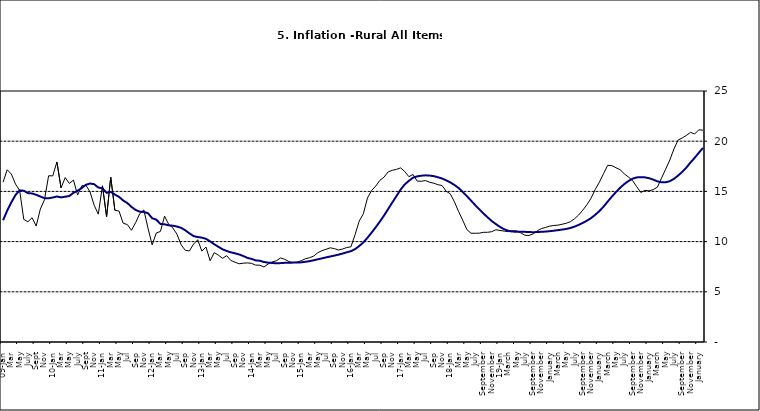
| Category | Series 0 | Series 1 |
|---|---|---|
| 09-Jan | 15.918 | 12.128 |
| Feb | 17.154 | 13.086 |
| Mar | 16.729 | 13.912 |
| Apr | 15.727 | 14.644 |
| May | 15.113 | 15.104 |
| June | 12.213 | 15.067 |
| July | 11.974 | 14.832 |
| Aug | 12.38 | 14.796 |
| Sept | 11.548 | 14.661 |
| Oct | 13.242 | 14.488 |
| Nov | 14.164 | 14.321 |
|  | 16.557 | 14.316 |
| 10-Jan | 16.548 | 14.39 |
| Feb | 17.934 | 14.494 |
| Mar | 15.346 | 14.401 |
| Apr | 16.373 | 14.473 |
| May | 15.794 | 14.54 |
| June | 16.126 | 14.862 |
| July | 14.634 | 15.072 |
| Aug | 15.556 | 15.33 |
| Sept | 15.616 | 15.658 |
| Oct | 14.955 | 15.786 |
| Nov | 13.616 | 15.719 |
| Dec | 12.735 | 15.385 |
| 11-Jan | 15.553 | 15.311 |
| Feb | 12.482 | 14.856 |
| Mar | 16.422 | 14.956 |
| Apr | 13.117 | 14.687 |
| May | 13.041 | 14.457 |
| Jun | 11.83 | 14.095 |
| Jul | 11.699 | 13.84 |
| Aug | 11.13 | 13.464 |
| Sep | 11.878 | 13.156 |
| Oct | 12.778 | 12.985 |
| Nov | 13.147 | 12.95 |
| Dec | 11.326 | 12.824 |
| 12-Jan | 9.678 | 12.33 |
| Feb | 10.856 | 12.188 |
| Mar | 11.014 | 11.76 |
| Apr | 12.536 | 11.724 |
| May | 11.712 | 11.621 |
| Jun | 11.36 | 11.582 |
| Jul | 10.733 | 11.499 |
| Aug | 9.683 | 11.368 |
| Sep | 9.132 | 11.131 |
| Oct | 9.071 | 10.82 |
| Nov | 9.758 | 10.548 |
| Dec | 10.183 | 10.455 |
| 13-Jan | 9.052 | 10.394 |
| Feb | 9.457 | 10.276 |
| Mar | 8.091 | 10.025 |
| Apr | 8.907 | 9.732 |
| May | 8.647 | 9.483 |
| Jun | 8.333 | 9.236 |
| Jul | 8.6 | 9.063 |
| Aug | 8.12 | 8.933 |
| Sep | 7.95 | 8.832 |
| Oct | 7.791 | 8.722 |
| Nov | 7.849 | 8.565 |
| Dec | 7.879 | 8.378 |
| 14-Jan | 7.832 | 8.277 |
| Feb | 7.657 | 8.13 |
| Mar | 7.65 | 8.092 |
| Apr | 7.473 | 7.973 |
| May | 7.761 | 7.901 |
| Jun | 7.98 | 7.874 |
| Jul | 8.086 | 7.834 |
| Aug | 8.368 | 7.858 |
| Sep | 8.244 | 7.883 |
| Oct | 8.019 | 7.903 |
| Nov | 7.898 | 7.906 |
| Dec | 7.955 | 7.913 |
| 15-Jan | 8.094 | 7.935 |
| Feb | 8.291 | 7.988 |
| Mar | 8.396 | 8.05 |
| Apr | 8.556 | 8.14 |
| May | 8.896 | 8.236 |
| Jun | 9.098 | 8.331 |
| Jul | 9.238 | 8.429 |
| Aug | 9.382 | 8.516 |
| Sep | 9.3 | 8.606 |
| Oct | 9.162 | 8.7 |
| Nov | 9.261 | 8.813 |
| Dec | 9.41 | 8.933 |
| 16-Jan | 9.48 | 9.047 |
| Feb | 10.692 | 9.249 |
| Mar | 12.038 | 9.559 |
| Apr | 12.767 | 9.917 |
| May | 14.349 | 10.384 |
| Jun | 15.088 | 10.897 |
| Jul | 15.533 | 11.433 |
| Aug | 16.103 | 12.002 |
| Sep | 16.428 | 12.601 |
| Oct | 16.947 | 13.25 |
| Nov | 17.099 | 13.898 |
| Dec | 17.195 | 14.54 |
| 17-Jan | 17.341 | 15.183 |
| Feb | 16.982 | 15.696 |
| Mar | 16.466 | 16.054 |
| Apr | 16.687 | 16.369 |
| May | 16.023 | 16.497 |
| Jun | 16.007 | 16.563 |
| Jul | 16.078 | 16.6 |
| Aug | 15.914 | 16.577 |
| Sep | 15.812 | 16.52 |
| Oct | 15.666 | 16.411 |
| Nov | 15.587 | 16.285 |
| Dec | 15.018 | 16.104 |
| 18-Jan | 14.756 | 15.892 |
| Feb | 13.957 | 15.638 |
| Mar | 12.987 | 15.339 |
| Apr | 12.126 | 14.95 |
| May | 11.199 | 14.53 |
| June | 10.832 | 14.083 |
| July | 10.831 | 13.636 |
| August | 10.838 | 13.209 |
| September | 10.924 | 12.804 |
| October | 10.927 | 12.418 |
| November | 10.986 | 12.049 |
| December | 11.183 | 11.746 |
| 19-Jan | 11.115 | 11.462 |
| February | 11.048 | 11.234 |
| March | 10.99 | 11.078 |
| April | 11.08 | 10.997 |
| May | 11.075 | 10.988 |
| June | 10.874 | 10.99 |
| July | 10.636 | 10.972 |
| August | 10.609 | 10.951 |
| September | 10.771 | 10.937 |
| October | 11.074 | 10.95 |
| November | 11.296 | 10.977 |
| December | 11.406 | 10.998 |
| January | 11.543 | 11.037 |
| February | 11.606 | 11.086 |
| March | 11.639 | 11.141 |
| April | 11.728 | 11.197 |
| May | 11.826 | 11.261 |
| June | 11.988 | 11.355 |
| July | 12.28 | 11.493 |
| August | 12.651 | 11.664 |
| September | 13.14 | 11.864 |
| October | 13.68 | 12.086 |
| November | 14.335 | 12.346 |
| December | 15.2 | 12.67 |
| January | 15.918 | 13.043 |
| February | 16.766 | 13.482 |
| March | 17.596 | 13.985 |
| April | 17.566 | 14.475 |
| May | 17.358 | 14.935 |
| June | 17.159 | 15.362 |
| July | 16.753 | 15.726 |
| August | 16.433 | 16.03 |
| September | 16.081 | 16.26 |
| October | 15.48 | 16.393 |
| November | 14.89 | 16.419 |
| December | 15.106 | 16.397 |
| January | 15.055 | 16.313 |
| February | 15.179 | 16.176 |
| March | 15.421 | 15.999 |
| April | 16.321 | 15.908 |
| May | 17.215 | 15.915 |
| June | 18.128 | 16.017 |
| July | 19.224 | 16.246 |
| August | 20.118 | 16.575 |
| September | 20.322 | 16.944 |
| October | 20.572 | 17.376 |
| November | 20.882 | 17.876 |
| December | 20.718 | 18.342 |
| January | 21.134 | 18.844 |
| February | 21.096 | 19.329 |